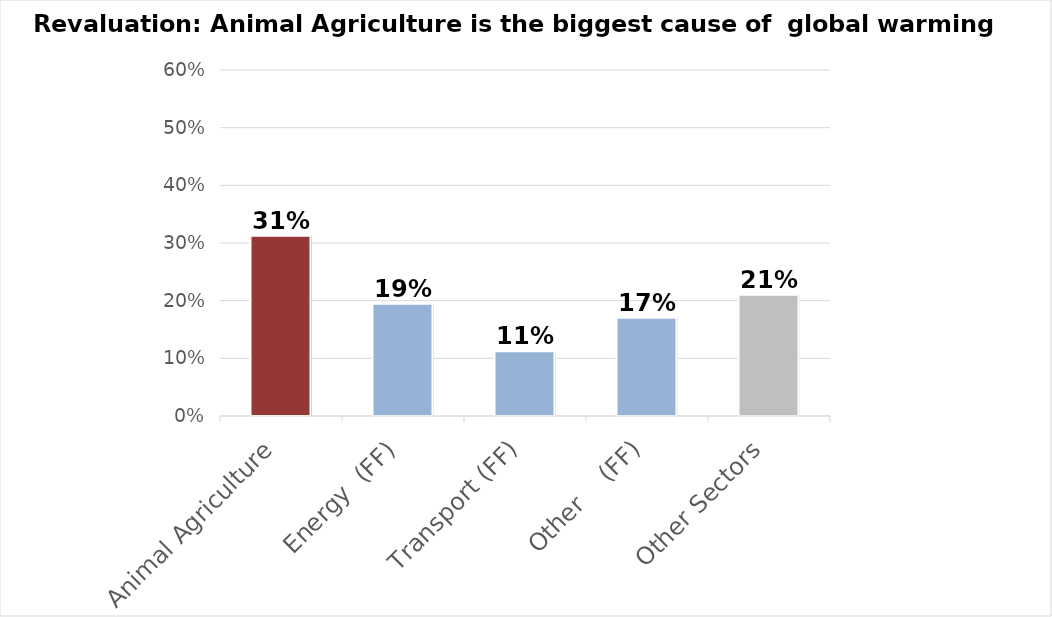
| Category | Series 0 |
|---|---|
| Animal Agriculture | 0.313 |
| Energy  (FF) | 0.195 |
| Transport (FF) | 0.112 |
| Other    (FF) | 0.17 |
| Other Sectors | 0.21 |